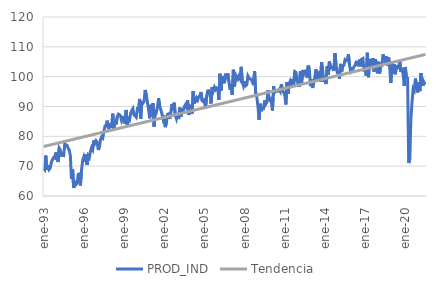
| Category | PROD_IND | Tendencia |
|---|---|---|
| 1993-01-01 | 69.223 | 76.579 |
| 1993-02-01 | 68.808 | 76.67 |
| 1993-03-01 | 73.558 | 76.76 |
| 1993-04-01 | 68.714 | 76.85 |
| 1993-05-01 | 70.252 | 76.941 |
| 1993-06-01 | 68.891 | 77.031 |
| 1993-07-01 | 69.404 | 77.121 |
| 1993-08-01 | 71.354 | 77.211 |
| 1993-09-01 | 72.186 | 77.302 |
| 1993-10-01 | 72.872 | 77.392 |
| 1993-11-01 | 72.707 | 77.482 |
| 1993-12-01 | 74.58 | 77.573 |
| 1994-01-01 | 73.252 | 77.663 |
| 1994-02-01 | 71.37 | 77.753 |
| 1994-03-01 | 76.052 | 77.843 |
| 1994-04-01 | 75.375 | 77.934 |
| 1994-05-01 | 73.581 | 78.024 |
| 1994-06-01 | 73.684 | 78.114 |
| 1994-07-01 | 73.563 | 78.205 |
| 1994-08-01 | 77.517 | 78.295 |
| 1994-09-01 | 77.071 | 78.385 |
| 1994-10-01 | 76.99 | 78.475 |
| 1994-11-01 | 76.079 | 78.566 |
| 1994-12-01 | 75.371 | 78.656 |
| 1995-01-01 | 73.454 | 78.746 |
| 1995-02-01 | 65.665 | 78.837 |
| 1995-03-01 | 68.981 | 78.927 |
| 1995-04-01 | 62.718 | 79.017 |
| 1995-05-01 | 64.524 | 79.107 |
| 1995-06-01 | 63.825 | 79.198 |
| 1995-07-01 | 64.188 | 79.288 |
| 1995-08-01 | 67.207 | 79.378 |
| 1995-09-01 | 67.358 | 79.469 |
| 1995-10-01 | 63.514 | 79.559 |
| 1995-11-01 | 68.632 | 79.649 |
| 1995-12-01 | 71.903 | 79.739 |
| 1996-01-01 | 73.095 | 79.83 |
| 1996-02-01 | 71.478 | 79.92 |
| 1996-03-01 | 73.904 | 80.01 |
| 1996-04-01 | 70.377 | 80.101 |
| 1996-05-01 | 73.492 | 80.191 |
| 1996-06-01 | 72.915 | 80.281 |
| 1996-07-01 | 74.957 | 80.371 |
| 1996-08-01 | 76.195 | 80.462 |
| 1996-09-01 | 75.5 | 80.552 |
| 1996-10-01 | 78.643 | 80.642 |
| 1996-11-01 | 77.676 | 80.732 |
| 1996-12-01 | 78.534 | 80.823 |
| 1997-01-01 | 78.042 | 80.913 |
| 1997-02-01 | 75.421 | 81.003 |
| 1997-03-01 | 76.5 | 81.094 |
| 1997-04-01 | 78.836 | 81.184 |
| 1997-05-01 | 79.786 | 81.274 |
| 1997-06-01 | 79.416 | 81.364 |
| 1997-07-01 | 81.516 | 81.455 |
| 1997-08-01 | 83.427 | 81.545 |
| 1997-09-01 | 83.615 | 81.635 |
| 1997-10-01 | 85.26 | 81.726 |
| 1997-11-01 | 82.84 | 81.816 |
| 1997-12-01 | 82.89 | 81.906 |
| 1998-01-01 | 84.349 | 81.996 |
| 1998-02-01 | 82.873 | 82.087 |
| 1998-03-01 | 87.574 | 82.177 |
| 1998-04-01 | 82.292 | 82.267 |
| 1998-05-01 | 85.262 | 82.358 |
| 1998-06-01 | 84.043 | 82.448 |
| 1998-07-01 | 86.598 | 82.538 |
| 1998-08-01 | 87.436 | 82.628 |
| 1998-09-01 | 87.24 | 82.719 |
| 1998-10-01 | 86.767 | 82.809 |
| 1998-11-01 | 85.116 | 82.899 |
| 1998-12-01 | 85.792 | 82.99 |
| 1999-01-01 | 86.842 | 83.08 |
| 1999-02-01 | 84.22 | 83.17 |
| 1999-03-01 | 88.848 | 83.26 |
| 1999-04-01 | 83.645 | 83.351 |
| 1999-05-01 | 85.872 | 83.441 |
| 1999-06-01 | 85.482 | 83.531 |
| 1999-07-01 | 87.771 | 83.622 |
| 1999-08-01 | 88.621 | 83.712 |
| 1999-09-01 | 89.269 | 83.802 |
| 1999-10-01 | 87.17 | 83.892 |
| 1999-11-01 | 86.928 | 83.983 |
| 1999-12-01 | 86.436 | 84.073 |
| 2000-01-01 | 89.189 | 84.163 |
| 2000-02-01 | 88.977 | 84.254 |
| 2000-03-01 | 92.545 | 84.344 |
| 2000-04-01 | 85.821 | 84.434 |
| 2000-05-01 | 91.385 | 84.524 |
| 2000-06-01 | 91.168 | 84.615 |
| 2000-07-01 | 91.726 | 84.705 |
| 2000-08-01 | 95.543 | 84.795 |
| 2000-09-01 | 93.853 | 84.885 |
| 2000-10-01 | 91.437 | 84.976 |
| 2000-11-01 | 89.18 | 85.066 |
| 2000-12-01 | 86.052 | 85.156 |
| 2001-01-01 | 90.568 | 85.247 |
| 2001-02-01 | 86.75 | 85.337 |
| 2001-03-01 | 91.09 | 85.427 |
| 2001-04-01 | 83.278 | 85.517 |
| 2001-05-01 | 88.425 | 85.608 |
| 2001-06-01 | 88.098 | 85.698 |
| 2001-07-01 | 89.689 | 85.788 |
| 2001-08-01 | 92.734 | 85.879 |
| 2001-09-01 | 90.203 | 85.969 |
| 2001-10-01 | 88.924 | 86.059 |
| 2001-11-01 | 87.544 | 86.149 |
| 2001-12-01 | 85.844 | 86.24 |
| 2002-01-01 | 86.944 | 86.33 |
| 2002-02-01 | 83.089 | 86.42 |
| 2002-03-01 | 84.523 | 86.511 |
| 2002-04-01 | 87.378 | 86.601 |
| 2002-05-01 | 87.538 | 86.691 |
| 2002-06-01 | 85.909 | 86.781 |
| 2002-07-01 | 88.161 | 86.872 |
| 2002-08-01 | 90.831 | 86.962 |
| 2002-09-01 | 88.669 | 87.052 |
| 2002-10-01 | 91.267 | 87.143 |
| 2002-11-01 | 86.976 | 87.233 |
| 2002-12-01 | 85.881 | 87.323 |
| 2003-01-01 | 87.56 | 87.413 |
| 2003-02-01 | 85.79 | 87.504 |
| 2003-03-01 | 89.638 | 87.594 |
| 2003-04-01 | 86.589 | 87.684 |
| 2003-05-01 | 88.739 | 87.775 |
| 2003-06-01 | 88.51 | 87.865 |
| 2003-07-01 | 89.92 | 87.955 |
| 2003-08-01 | 90.563 | 88.045 |
| 2003-09-01 | 89.769 | 88.136 |
| 2003-10-01 | 92.114 | 88.226 |
| 2003-11-01 | 87.162 | 88.316 |
| 2003-12-01 | 89.238 | 88.407 |
| 2004-01-01 | 90.624 | 88.497 |
| 2004-02-01 | 87.637 | 88.587 |
| 2004-03-01 | 95.166 | 88.677 |
| 2004-04-01 | 90.997 | 88.768 |
| 2004-05-01 | 91.875 | 88.858 |
| 2004-06-01 | 92.866 | 88.948 |
| 2004-07-01 | 92.174 | 89.038 |
| 2004-08-01 | 93.286 | 89.129 |
| 2004-09-01 | 93.595 | 89.219 |
| 2004-10-01 | 94.853 | 89.309 |
| 2004-11-01 | 91.945 | 89.4 |
| 2004-12-01 | 91.632 | 89.49 |
| 2005-01-01 | 92.064 | 89.58 |
| 2005-02-01 | 89.166 | 89.67 |
| 2005-03-01 | 93.268 | 89.761 |
| 2005-04-01 | 95.221 | 89.851 |
| 2005-05-01 | 95.3 | 89.941 |
| 2005-06-01 | 94.261 | 90.032 |
| 2005-07-01 | 91.007 | 90.122 |
| 2005-08-01 | 96.513 | 90.212 |
| 2005-09-01 | 95.232 | 90.302 |
| 2005-10-01 | 96.444 | 90.393 |
| 2005-11-01 | 95.684 | 90.483 |
| 2005-12-01 | 96.284 | 90.573 |
| 2006-01-01 | 96.123 | 90.664 |
| 2006-02-01 | 92.244 | 90.754 |
| 2006-03-01 | 100.973 | 90.844 |
| 2006-04-01 | 95.355 | 90.934 |
| 2006-05-01 | 100.167 | 91.025 |
| 2006-06-01 | 99.058 | 91.115 |
| 2006-07-01 | 97.794 | 91.205 |
| 2006-08-01 | 100.984 | 91.296 |
| 2006-09-01 | 99.373 | 91.386 |
| 2006-10-01 | 101.065 | 91.476 |
| 2006-11-01 | 98.323 | 91.566 |
| 2006-12-01 | 95.669 | 91.657 |
| 2007-01-01 | 97.325 | 91.747 |
| 2007-02-01 | 93.927 | 91.837 |
| 2007-03-01 | 102.315 | 91.928 |
| 2007-04-01 | 96.649 | 92.018 |
| 2007-05-01 | 100.642 | 92.108 |
| 2007-06-01 | 99.94 | 92.198 |
| 2007-07-01 | 99.203 | 92.289 |
| 2007-08-01 | 100.183 | 92.379 |
| 2007-09-01 | 99.37 | 92.469 |
| 2007-10-01 | 103.296 | 92.56 |
| 2007-11-01 | 98.231 | 92.65 |
| 2007-12-01 | 96.955 | 92.74 |
| 2008-01-01 | 98.414 | 92.83 |
| 2008-02-01 | 96.94 | 92.921 |
| 2008-03-01 | 97.254 | 93.011 |
| 2008-04-01 | 100.268 | 93.101 |
| 2008-05-01 | 99.579 | 93.191 |
| 2008-06-01 | 99.229 | 93.282 |
| 2008-07-01 | 99.118 | 93.372 |
| 2008-08-01 | 98.257 | 93.462 |
| 2008-09-01 | 97.198 | 93.553 |
| 2008-10-01 | 101.8 | 93.643 |
| 2008-11-01 | 94.394 | 93.733 |
| 2008-12-01 | 93.115 | 93.823 |
| 2009-01-01 | 90.11 | 93.914 |
| 2009-02-01 | 85.557 | 94.004 |
| 2009-03-01 | 90.926 | 94.094 |
| 2009-04-01 | 88.454 | 94.185 |
| 2009-05-01 | 89.43 | 94.275 |
| 2009-06-01 | 89.344 | 94.365 |
| 2009-07-01 | 92.036 | 94.455 |
| 2009-08-01 | 90.782 | 94.546 |
| 2009-09-01 | 91.463 | 94.636 |
| 2009-10-01 | 95.445 | 94.726 |
| 2009-11-01 | 92.246 | 94.817 |
| 2009-12-01 | 91.892 | 94.907 |
| 2010-01-01 | 92.981 | 94.997 |
| 2010-02-01 | 88.696 | 95.087 |
| 2010-03-01 | 96.827 | 95.178 |
| 2010-04-01 | 94.778 | 95.268 |
| 2010-05-01 | 95.144 | 95.358 |
| 2010-06-01 | 95.103 | 95.449 |
| 2010-07-01 | 95.193 | 95.539 |
| 2010-08-01 | 95.685 | 95.629 |
| 2010-09-01 | 95.022 | 95.719 |
| 2010-10-01 | 97.47 | 95.81 |
| 2010-11-01 | 95.411 | 95.9 |
| 2010-12-01 | 94.713 | 95.99 |
| 2011-01-01 | 93.96 | 96.081 |
| 2011-02-01 | 90.691 | 96.171 |
| 2011-03-01 | 98.182 | 96.261 |
| 2011-04-01 | 94.315 | 96.351 |
| 2011-05-01 | 97.669 | 96.442 |
| 2011-06-01 | 98.591 | 96.532 |
| 2011-07-01 | 97.673 | 96.622 |
| 2011-08-01 | 99.204 | 96.713 |
| 2011-09-01 | 97.146 | 96.803 |
| 2011-10-01 | 101.696 | 96.893 |
| 2011-11-01 | 101.445 | 96.983 |
| 2011-12-01 | 98.846 | 97.074 |
| 2012-01-01 | 97.419 | 97.164 |
| 2012-02-01 | 96.596 | 97.254 |
| 2012-03-01 | 101.729 | 97.344 |
| 2012-04-01 | 97.343 | 97.435 |
| 2012-05-01 | 102.214 | 97.525 |
| 2012-06-01 | 100.865 | 97.615 |
| 2012-07-01 | 101.886 | 97.706 |
| 2012-08-01 | 101.952 | 97.796 |
| 2012-09-01 | 99.662 | 97.886 |
| 2012-10-01 | 103.738 | 97.976 |
| 2012-11-01 | 102.47 | 98.067 |
| 2012-12-01 | 96.809 | 98.157 |
| 2013-01-01 | 99.142 | 98.247 |
| 2013-02-01 | 96.198 | 98.338 |
| 2013-03-01 | 97.971 | 98.428 |
| 2013-04-01 | 99.927 | 98.518 |
| 2013-05-01 | 102.471 | 98.608 |
| 2013-06-01 | 98.648 | 98.699 |
| 2013-07-01 | 100.628 | 98.789 |
| 2013-08-01 | 101.832 | 98.879 |
| 2013-09-01 | 98.342 | 98.97 |
| 2013-10-01 | 104.849 | 99.06 |
| 2013-11-01 | 101.786 | 99.15 |
| 2013-12-01 | 98.206 | 99.24 |
| 2014-01-01 | 100.117 | 99.331 |
| 2014-02-01 | 97.526 | 99.421 |
| 2014-03-01 | 103.472 | 99.511 |
| 2014-04-01 | 100.697 | 99.602 |
| 2014-05-01 | 105.06 | 99.692 |
| 2014-06-01 | 102.892 | 99.782 |
| 2014-07-01 | 103.247 | 99.872 |
| 2014-08-01 | 102.845 | 99.963 |
| 2014-09-01 | 102.005 | 100.053 |
| 2014-10-01 | 107.841 | 100.143 |
| 2014-11-01 | 103.682 | 100.234 |
| 2014-12-01 | 101.491 | 100.324 |
| 2015-01-01 | 101.659 | 100.414 |
| 2015-02-01 | 99.33 | 100.504 |
| 2015-03-01 | 104.281 | 100.595 |
| 2015-04-01 | 101.701 | 100.685 |
| 2015-05-01 | 103.641 | 100.775 |
| 2015-06-01 | 103.9 | 100.866 |
| 2015-07-01 | 105.683 | 100.956 |
| 2015-08-01 | 105.383 | 101.046 |
| 2015-09-01 | 105.595 | 101.136 |
| 2015-10-01 | 107.504 | 101.227 |
| 2015-11-01 | 103.804 | 101.317 |
| 2015-12-01 | 101.951 | 101.407 |
| 2016-01-01 | 102.67 | 101.497 |
| 2016-02-01 | 102.496 | 101.588 |
| 2016-03-01 | 103.325 | 101.678 |
| 2016-04-01 | 103.786 | 101.768 |
| 2016-05-01 | 104.893 | 101.859 |
| 2016-06-01 | 104.805 | 101.949 |
| 2016-07-01 | 103.456 | 102.039 |
| 2016-08-01 | 105.709 | 102.129 |
| 2016-09-01 | 103.444 | 102.22 |
| 2016-10-01 | 105.925 | 102.31 |
| 2016-11-01 | 106.116 | 102.4 |
| 2016-12-01 | 101.748 | 102.491 |
| 2017-01-01 | 103.487 | 102.581 |
| 2017-02-01 | 100.361 | 102.671 |
| 2017-03-01 | 107.994 | 102.761 |
| 2017-04-01 | 99.812 | 102.852 |
| 2017-05-01 | 105.537 | 102.942 |
| 2017-06-01 | 105.541 | 103.032 |
| 2017-07-01 | 102.906 | 103.123 |
| 2017-08-01 | 106.225 | 103.213 |
| 2017-09-01 | 101.671 | 103.303 |
| 2017-10-01 | 105.8 | 103.393 |
| 2017-11-01 | 104.813 | 103.484 |
| 2017-12-01 | 101.113 | 103.574 |
| 2018-01-01 | 104.981 | 103.664 |
| 2018-02-01 | 101.092 | 103.755 |
| 2018-03-01 | 104.222 | 103.845 |
| 2018-04-01 | 103.986 | 103.935 |
| 2018-05-01 | 107.482 | 104.025 |
| 2018-06-01 | 106.311 | 104.116 |
| 2018-07-01 | 104.688 | 104.206 |
| 2018-08-01 | 106.76 | 104.296 |
| 2018-09-01 | 103.591 | 104.387 |
| 2018-10-01 | 106.55 | 104.477 |
| 2018-11-01 | 103.183 | 104.567 |
| 2018-12-01 | 97.869 | 104.657 |
| 2019-01-01 | 104.466 | 104.748 |
| 2019-02-01 | 100.898 | 104.838 |
| 2019-03-01 | 104.098 | 104.928 |
| 2019-04-01 | 100.801 | 105.019 |
| 2019-05-01 | 103.836 | 105.109 |
| 2019-06-01 | 102.92 | 105.199 |
| 2019-07-01 | 103.082 | 105.289 |
| 2019-08-01 | 105.339 | 105.38 |
| 2019-09-01 | 101.644 | 105.47 |
| 2019-10-01 | 102.99 | 105.56 |
| 2019-11-01 | 101.035 | 105.65 |
| 2019-12-01 | 96.907 | 105.741 |
| 2020-01-01 | 103.247 | 105.831 |
| 2020-02-01 | 99.593 | 105.921 |
| 2020-03-01 | 99.516 | 106.012 |
| 2020-04-01 | 71.047 | 106.102 |
| 2020-05-01 | 72.284 | 106.192 |
| 2020-06-01 | 86.106 | 106.282 |
| 2020-07-01 | 91.588 | 106.373 |
| 2020-08-01 | 95.987 | 106.463 |
| 2020-09-01 | 95.386 | 106.553 |
| 2020-10-01 | 99.379 | 106.644 |
| 2020-11-01 | 97.067 | 106.734 |
| 2020-12-01 | 94.705 | 106.824 |
| 2021-01-01 | 98.042 | 106.914 |
| 2021-02-01 | 95.148 | 107.005 |
| 2021-03-01 | 101.194 | 107.095 |
| 2021-04-01 | 96.974 | 107.185 |
| 2021-05-01 | 98.61 | 107.276 |
| 2021-06-01 | 97.719 | 107.366 |
| 2021-07-01 | 98.252 | 107.456 |